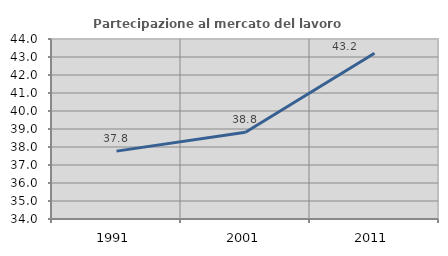
| Category | Partecipazione al mercato del lavoro  femminile |
|---|---|
| 1991.0 | 37.771 |
| 2001.0 | 38.823 |
| 2011.0 | 43.209 |